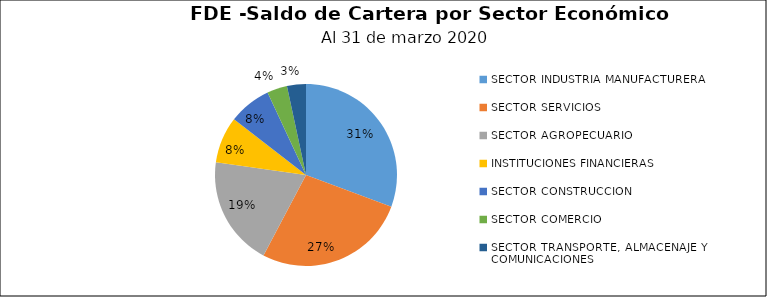
| Category | Saldo | Créditos |
|---|---|---|
| SECTOR INDUSTRIA MANUFACTURERA | 14.975 | 251 |
| SECTOR SERVICIOS | 13.221 | 189 |
| SECTOR AGROPECUARIO | 9.51 | 80 |
| INSTITUCIONES FINANCIERAS | 4.031 | 9 |
| SECTOR CONSTRUCCION | 3.707 | 14 |
| SECTOR COMERCIO | 1.747 | 174 |
| SECTOR TRANSPORTE, ALMACENAJE Y COMUNICACIONES | 1.64 | 8 |